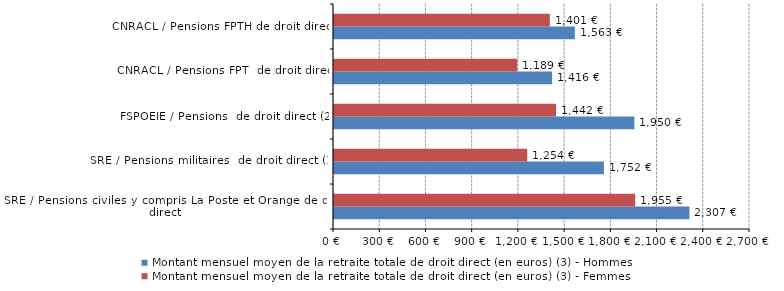
| Category | Montant mensuel moyen de la retraite totale de droit direct (en euros) (3) - Hommes | Montant mensuel moyen de la retraite totale de droit direct (en euros) (3) - Femmes |
|---|---|---|
| SRE / Pensions civiles y compris La Poste et Orange de droit direct | 2307.109 | 1955.08 |
| SRE / Pensions militaires  de droit direct (1) | 1751.759 | 1253.832 |
| FSPOEIE / Pensions  de droit direct (2) | 1949.52 | 1441.84 |
| CNRACL / Pensions FPT  de droit direct | 1415.557 | 1189.298 |
| CNRACL / Pensions FPTH de droit direct | 1563.261 | 1400.798 |